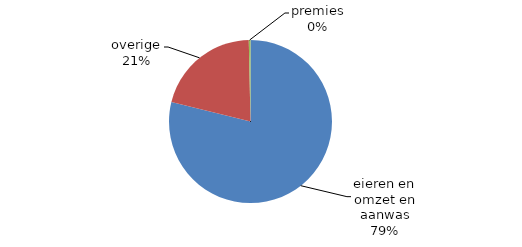
| Category | Series 4 |
|---|---|
| eieren en omzet en aanwas | 936218.149 |
| overige | 246973.497 |
| premies | 3990.697 |